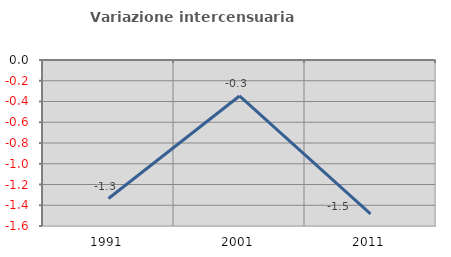
| Category | Variazione intercensuaria annua |
|---|---|
| 1991.0 | -1.335 |
| 2001.0 | -0.347 |
| 2011.0 | -1.484 |